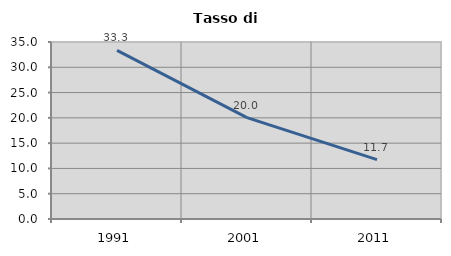
| Category | Tasso di disoccupazione   |
|---|---|
| 1991.0 | 33.333 |
| 2001.0 | 20.049 |
| 2011.0 | 11.749 |